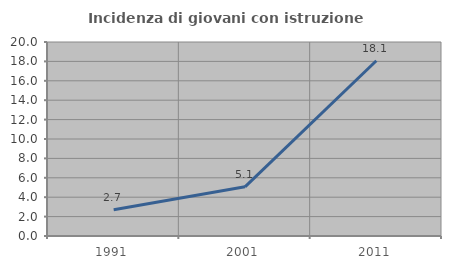
| Category | Incidenza di giovani con istruzione universitaria |
|---|---|
| 1991.0 | 2.711 |
| 2001.0 | 5.07 |
| 2011.0 | 18.065 |